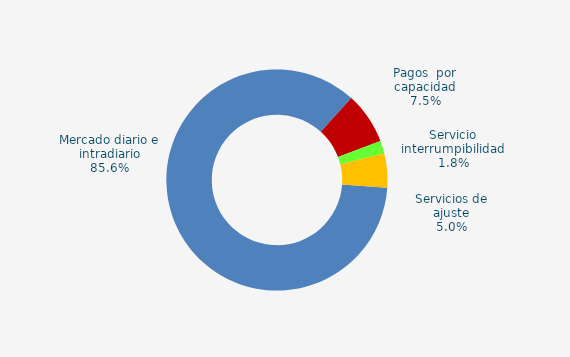
| Category | Series 0 |
|---|---|
| Mercado diario e intradiario | 35.34 |
| Pagos  por capacidad | 3.11 |
| Servicio interrumpibilidad | 0.76 |
| Servicios de ajuste | 2.07 |